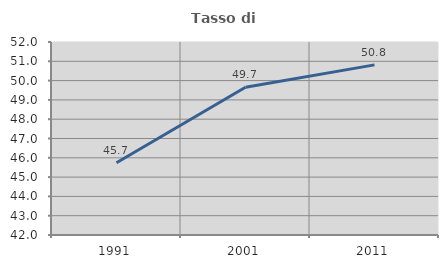
| Category | Tasso di occupazione   |
|---|---|
| 1991.0 | 45.745 |
| 2001.0 | 49.654 |
| 2011.0 | 50.814 |